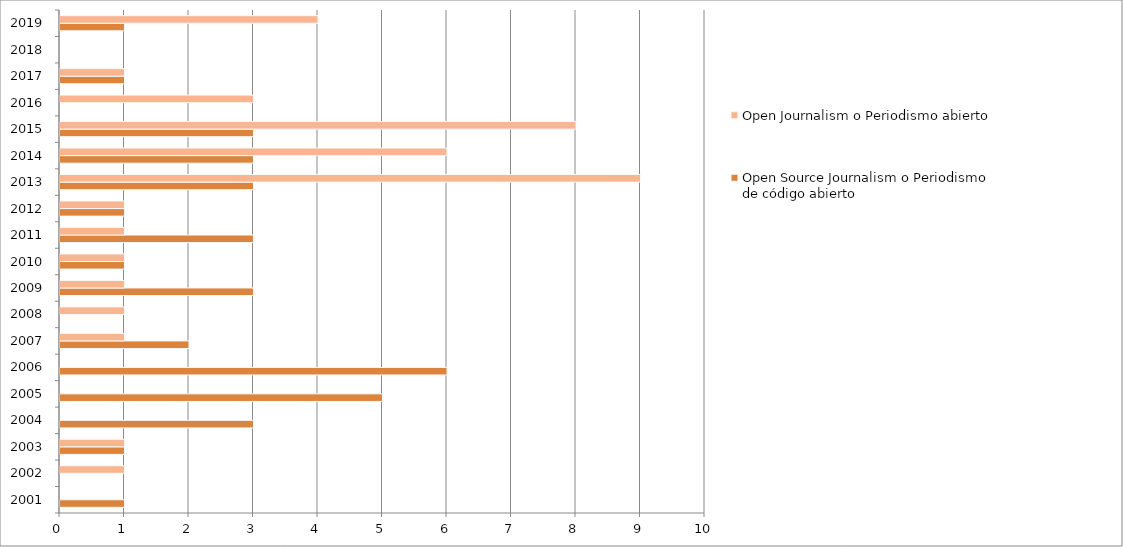
| Category | Open Source Journalism o Periodismo de código abierto  | Open Journalism o Periodismo abierto  |
|---|---|---|
| 2001.0 | 1 | 0 |
| 2002.0 | 0 | 1 |
| 2003.0 | 1 | 1 |
| 2004.0 | 3 | 0 |
| 2005.0 | 5 | 0 |
| 2006.0 | 6 | 0 |
| 2007.0 | 2 | 1 |
| 2008.0 | 0 | 1 |
| 2009.0 | 3 | 1 |
| 2010.0 | 1 | 1 |
| 2011.0 | 3 | 1 |
| 2012.0 | 1 | 1 |
| 2013.0 | 3 | 9 |
| 2014.0 | 3 | 6 |
| 2015.0 | 3 | 8 |
| 2016.0 | 0 | 3 |
| 2017.0 | 1 | 1 |
| 2018.0 | 0 | 0 |
| 2019.0 | 1 | 4 |